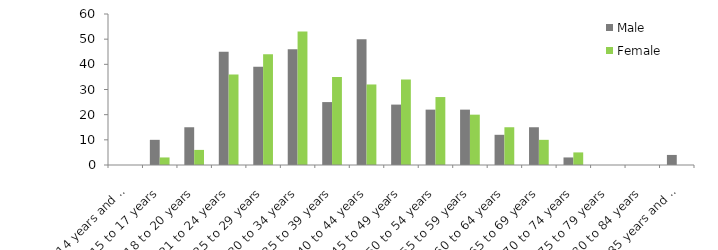
| Category | Male | Female |
|---|---|---|
| 14 years and under | 0 | 0 |
| 15 to 17 years | 10 | 3 |
| 18 to 20 years | 15 | 6 |
| 21 to 24 years | 45 | 36 |
| 25 to 29 years | 39 | 44 |
| 30 to 34 years | 46 | 53 |
| 35 to 39 years | 25 | 35 |
| 40 to 44 years | 50 | 32 |
| 45 to 49 years | 24 | 34 |
| 50 to 54 years | 22 | 27 |
| 55 to 59 years | 22 | 20 |
| 60 to 64 years | 12 | 15 |
| 65 to 69 years | 15 | 10 |
| 70 to 74 years | 3 | 5 |
| 75 to 79 years | 0 | 0 |
| 80 to 84 years | 0 | 0 |
| 85 years and over | 4 | 0 |